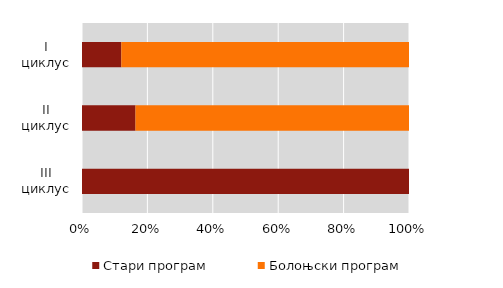
| Category | Стари програм | Болоњски програм |
|---|---|---|
| III циклус | 43 | 0 |
| II циклус | 293 | 1498 |
| I циклус | 5593 | 40954 |